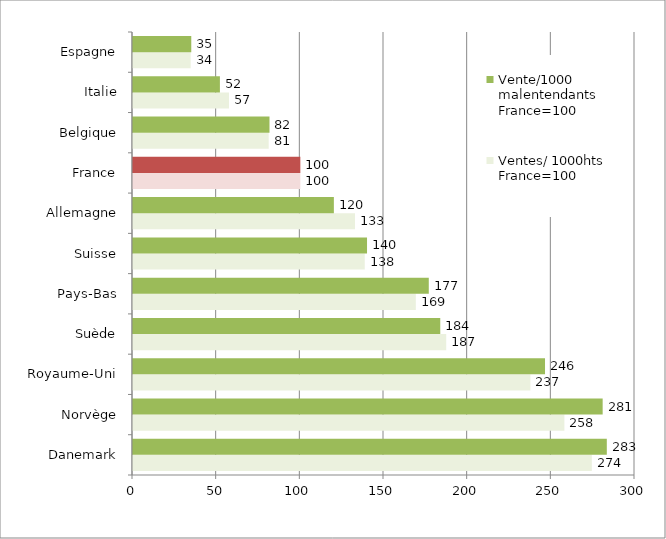
| Category | Ventes/ 1000hts France=100 | Vente/1000 malentendants France=100 |
|---|---|---|
| Danemark | 274.194 | 283.157 |
| Norvège | 257.793 | 280.675 |
| Royaume-Uni | 237.479 | 246.224 |
| Suède | 187.177 | 183.618 |
| Pays-Bas | 169.017 | 176.761 |
| Suisse | 138.498 | 139.859 |
| Allemagne | 132.666 | 120.044 |
| France | 100 | 100 |
| Belgique | 81.094 | 81.568 |
| Italie | 57.361 | 51.934 |
| Espagne | 34.448 | 34.822 |